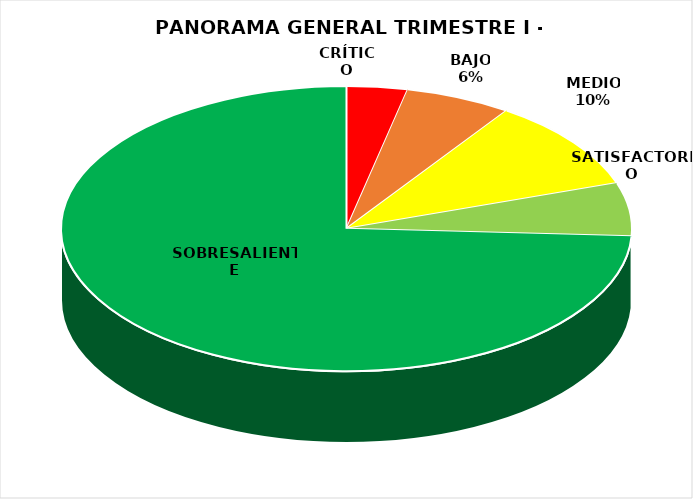
| Category | Series 0 |
|---|---|
| CRÍTICO | 4 |
| BAJO | 7 |
| MEDIO | 12 |
| SATISFACTORIO | 7 |
| SOBRESALIENTE | 86 |